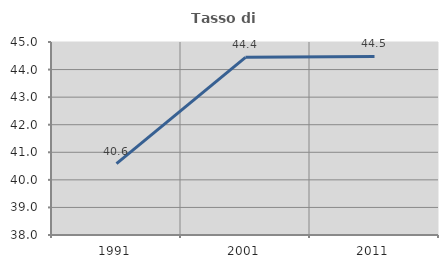
| Category | Tasso di occupazione   |
|---|---|
| 1991.0 | 40.591 |
| 2001.0 | 44.444 |
| 2011.0 | 44.474 |